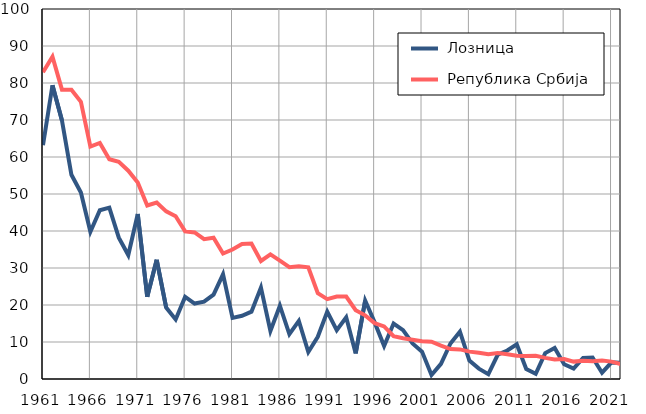
| Category |  Лозница |  Република Србија |
|---|---|---|
| 1961.0 | 63.2 | 82.9 |
| 1962.0 | 79.4 | 87.1 |
| 1963.0 | 69.9 | 78.2 |
| 1964.0 | 55.2 | 78.2 |
| 1965.0 | 50.4 | 74.9 |
| 1966.0 | 39.8 | 62.8 |
| 1967.0 | 45.6 | 63.8 |
| 1968.0 | 46.3 | 59.4 |
| 1969.0 | 38.2 | 58.7 |
| 1970.0 | 33.5 | 56.3 |
| 1971.0 | 44.6 | 53.1 |
| 1972.0 | 22.2 | 46.9 |
| 1973.0 | 32.2 | 47.7 |
| 1974.0 | 19.3 | 45.3 |
| 1975.0 | 16.1 | 44 |
| 1976.0 | 22.2 | 39.9 |
| 1977.0 | 20.4 | 39.6 |
| 1978.0 | 20.9 | 37.8 |
| 1979.0 | 22.8 | 38.2 |
| 1980.0 | 28.3 | 33.9 |
| 1981.0 | 16.5 | 35 |
| 1982.0 | 17.1 | 36.5 |
| 1983.0 | 18.2 | 36.6 |
| 1984.0 | 24.7 | 31.9 |
| 1985.0 | 13 | 33.7 |
| 1986.0 | 19.8 | 32 |
| 1987.0 | 12.1 | 30.2 |
| 1988.0 | 15.7 | 30.5 |
| 1989.0 | 7.3 | 30.2 |
| 1990.0 | 11.4 | 23.2 |
| 1991.0 | 18.2 | 21.6 |
| 1992.0 | 13.2 | 22.3 |
| 1993.0 | 16.7 | 22.3 |
| 1994.0 | 6.9 | 18.6 |
| 1995.0 | 21.2 | 17.2 |
| 1996.0 | 15.3 | 15.1 |
| 1997.0 | 8.9 | 14.2 |
| 1998.0 | 15 | 11.6 |
| 1999.0 | 13.2 | 11 |
| 2000.0 | 9.6 | 10.6 |
| 2001.0 | 7.4 | 10.2 |
| 2002.0 | 1.1 | 10.1 |
| 2003.0 | 4.1 | 9 |
| 2004.0 | 9.6 | 8.1 |
| 2005.0 | 12.8 | 8 |
| 2006.0 | 5 | 7.4 |
| 2007.0 | 2.8 | 7.1 |
| 2008.0 | 1.3 | 6.7 |
| 2009.0 | 6.6 | 7 |
| 2010.0 | 7.7 | 6.7 |
| 2011.0 | 9.4 | 6.3 |
| 2012.0 | 2.7 | 6.2 |
| 2013.0 | 1.4 | 6.3 |
| 2014.0 | 7 | 5.7 |
| 2015.0 | 8.4 | 5.3 |
| 2016.0 | 4 | 5.4 |
| 2017.0 | 2.8 | 4.7 |
| 2018.0 | 5.7 | 4.9 |
| 2019.0 | 5.8 | 4.8 |
| 2020.0 | 1.7 | 5 |
| 2021.0 | 4.5 | 4.7 |
| 2022.0 | 4.4 | 4 |